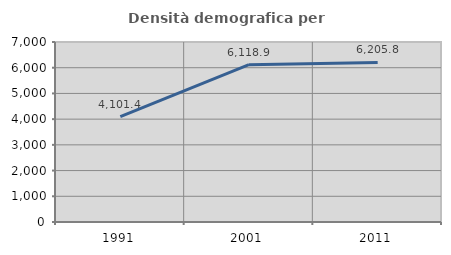
| Category | Densità demografica |
|---|---|
| 1991.0 | 4101.445 |
| 2001.0 | 6118.854 |
| 2011.0 | 6205.774 |